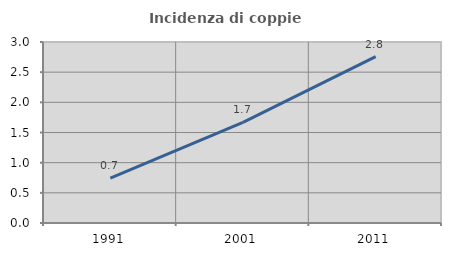
| Category | Incidenza di coppie miste |
|---|---|
| 1991.0 | 0.745 |
| 2001.0 | 1.668 |
| 2011.0 | 2.759 |